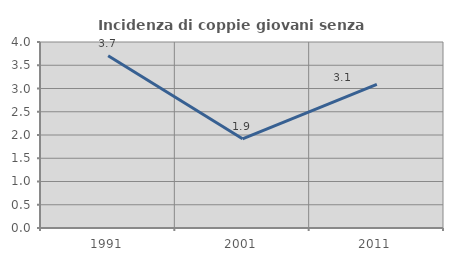
| Category | Incidenza di coppie giovani senza figli |
|---|---|
| 1991.0 | 3.704 |
| 2001.0 | 1.919 |
| 2011.0 | 3.088 |